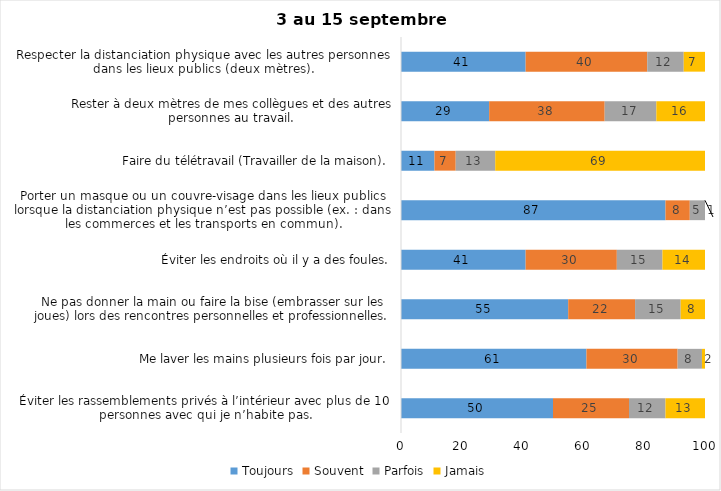
| Category | Toujours | Souvent | Parfois | Jamais |
|---|---|---|---|---|
| Éviter les rassemblements privés à l’intérieur avec plus de 10 personnes avec qui je n’habite pas. | 50 | 25 | 12 | 13 |
| Me laver les mains plusieurs fois par jour. | 61 | 30 | 8 | 2 |
| Ne pas donner la main ou faire la bise (embrasser sur les joues) lors des rencontres personnelles et professionnelles. | 55 | 22 | 15 | 8 |
| Éviter les endroits où il y a des foules. | 41 | 30 | 15 | 14 |
| Porter un masque ou un couvre-visage dans les lieux publics lorsque la distanciation physique n’est pas possible (ex. : dans les commerces et les transports en commun). | 87 | 8 | 5 | 1 |
| Faire du télétravail (Travailler de la maison). | 11 | 7 | 13 | 69 |
| Rester à deux mètres de mes collègues et des autres personnes au travail. | 29 | 38 | 17 | 16 |
| Respecter la distanciation physique avec les autres personnes dans les lieux publics (deux mètres). | 41 | 40 | 12 | 7 |